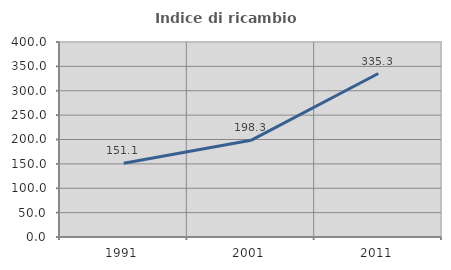
| Category | Indice di ricambio occupazionale  |
|---|---|
| 1991.0 | 151.099 |
| 2001.0 | 198.266 |
| 2011.0 | 335.343 |